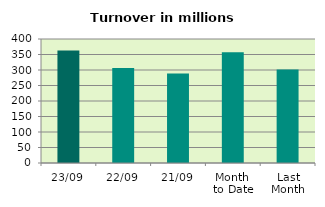
| Category | Series 0 |
|---|---|
| 23/09 | 362.898 |
| 22/09 | 306.156 |
| 21/09 | 288.945 |
| Month 
to Date | 357.023 |
| Last
Month | 301.741 |